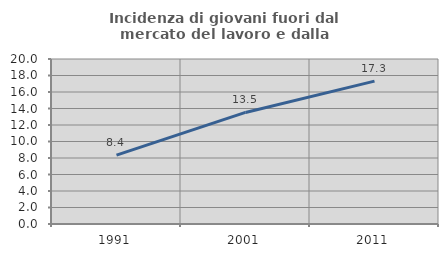
| Category | Incidenza di giovani fuori dal mercato del lavoro e dalla formazione  |
|---|---|
| 1991.0 | 8.353 |
| 2001.0 | 13.523 |
| 2011.0 | 17.323 |